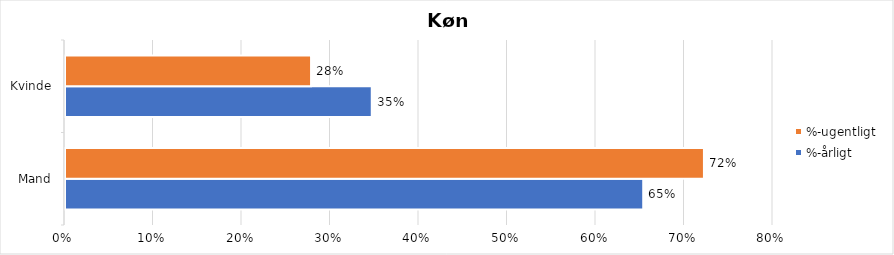
| Category | %-årligt | %-ugentligt |
|---|---|---|
| Mand | 0.653 | 0.722 |
| Kvinde | 0.347 | 0.278 |